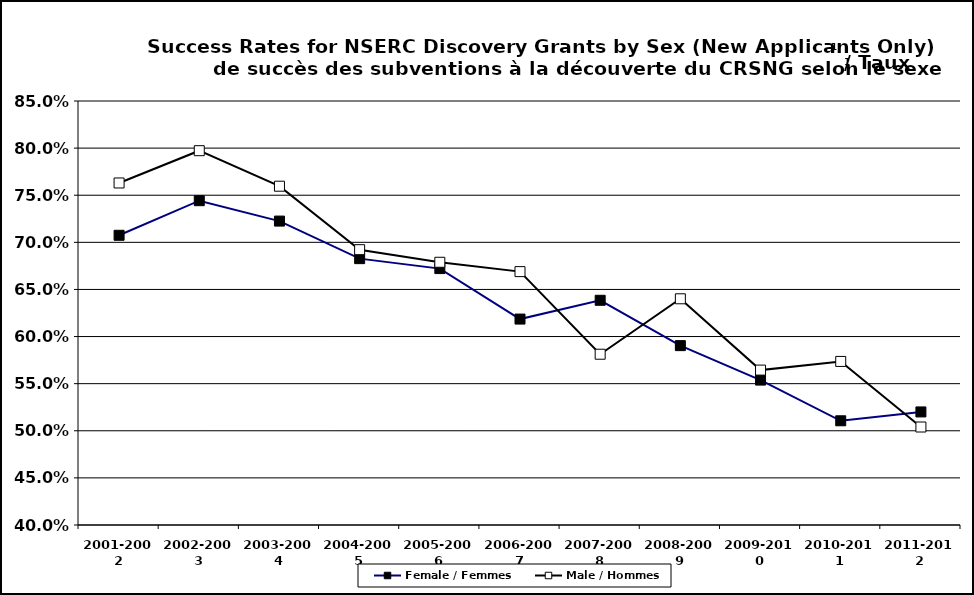
| Category | Female / Femmes | Male / Hommes |
|---|---|---|
| 2001-2002 | 0.707 | 0.763 |
| 2002-2003 | 0.744 | 0.797 |
| 2003-2004 | 0.723 | 0.76 |
| 2004-2005 | 0.683 | 0.692 |
| 2005-2006 | 0.672 | 0.679 |
| 2006-2007 | 0.619 | 0.669 |
| 2007-2008 | 0.638 | 0.581 |
| 2008-2009 | 0.59 | 0.64 |
| 2009-2010 | 0.554 | 0.564 |
| 2010-2011 | 0.511 | 0.574 |
| 2011-2012 | 0.52 | 0.504 |